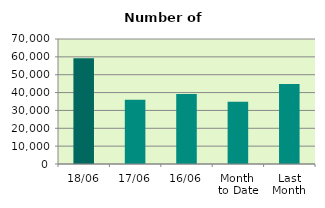
| Category | Series 0 |
|---|---|
| 18/06 | 59156 |
| 17/06 | 35918 |
| 16/06 | 39198 |
| Month 
to Date | 34925.286 |
| Last
Month | 44751.81 |